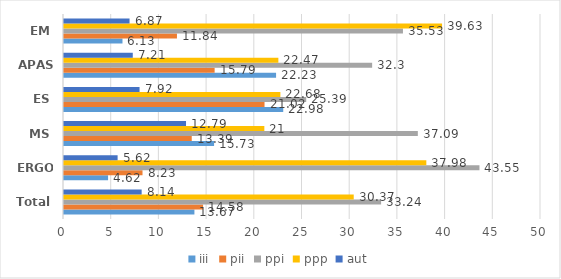
| Category | iii | pii | ppi | ppp | aut |
|---|---|---|---|---|---|
| Total | 13.67 | 14.58 | 33.24 | 30.37 | 8.14 |
| ERGO | 4.62 | 8.23 | 43.55 | 37.98 | 5.62 |
| MS | 15.73 | 13.39 | 37.09 | 21 | 12.79 |
| ES | 22.98 | 21.02 | 25.39 | 22.68 | 7.92 |
| APAS | 22.23 | 15.79 | 32.3 | 22.47 | 7.21 |
|  EM | 6.13 | 11.84 | 35.53 | 39.63 | 6.87 |